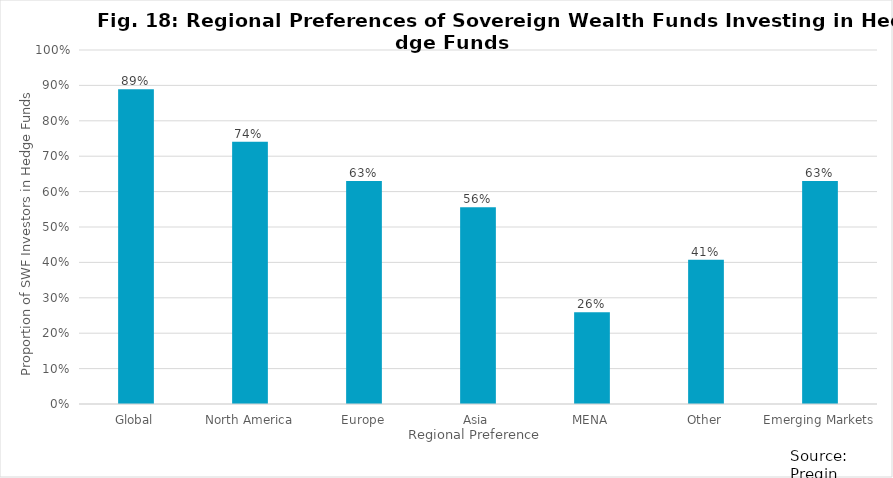
| Category | Series 0 |
|---|---|
| Global | 0.889 |
| North America | 0.741 |
| Europe | 0.63 |
| Asia | 0.556 |
| MENA | 0.259 |
| Other | 0.407 |
| Emerging Markets | 0.63 |